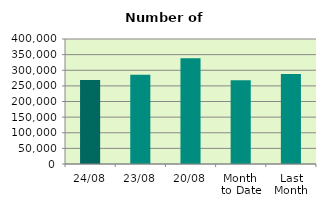
| Category | Series 0 |
|---|---|
| 24/08 | 268786 |
| 23/08 | 285428 |
| 20/08 | 338618 |
| Month 
to Date | 268006.353 |
| Last
Month | 287917.636 |